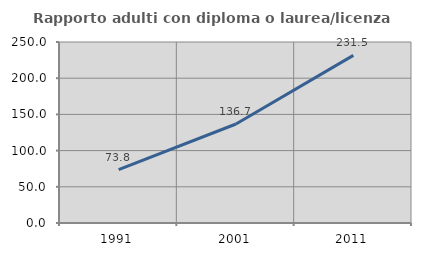
| Category | Rapporto adulti con diploma o laurea/licenza media  |
|---|---|
| 1991.0 | 73.757 |
| 2001.0 | 136.729 |
| 2011.0 | 231.506 |